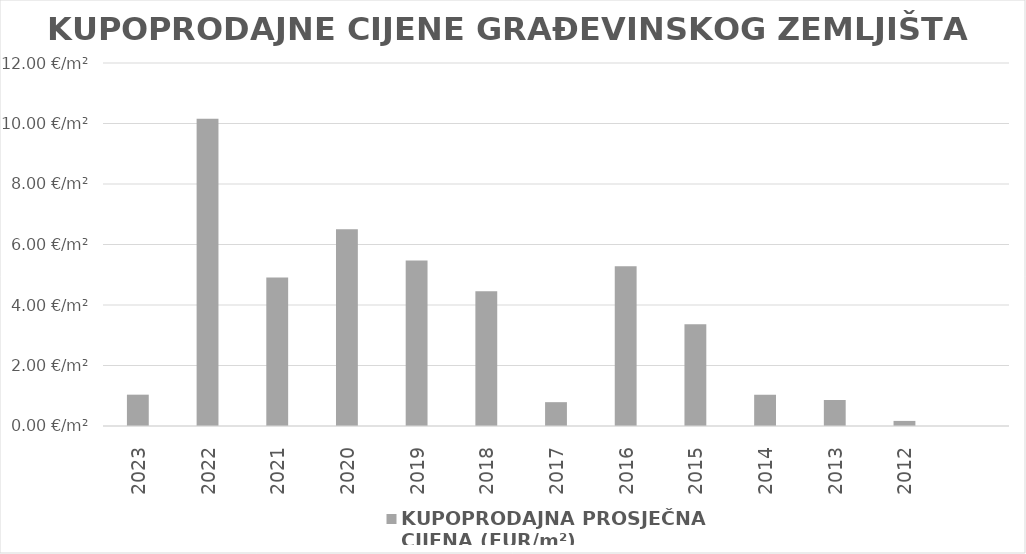
| Category | KUPOPRODAJNA PROSJEČNA 
CIJENA (EUR/m²) |
|---|---|
| 2023 | 1900-01-01 00:51:16 |
| 2022 | 1900-01-10 03:50:07 |
| 2021 | 1900-01-04 21:50:32 |
| 2020 | 1900-01-06 12:01:57 |
| 2019 | 1900-01-05 11:15:11 |
| 2018 | 1900-01-04 10:55:17 |
| 2017 | 0.788 |
| 2016 | 1900-01-05 06:41:32 |
| 2015 | 1900-01-03 08:44:45 |
| 2014 | 1900-01-01 00:47:47 |
| 2013 | 0.859 |
| 2012 | 0.168 |